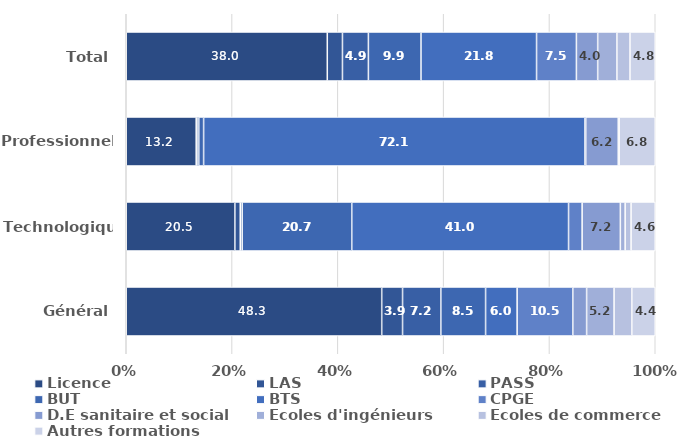
| Category | Licence | LAS | PASS | BUT | BTS | CPGE | D.E sanitaire et social | Ecoles d'ingénieurs | Ecoles de commerce | Autres formations |
|---|---|---|---|---|---|---|---|---|---|---|
| Général | 48.292 | 3.938 | 7.239 | 8.457 | 5.966 | 10.522 | 2.612 | 5.19 | 3.352 | 4.432 |
| Technologique | 20.53 | 1.021 | 0.362 | 20.717 | 40.982 | 2.566 | 7.225 | 0.907 | 1.121 | 4.57 |
| Professionnel | 13.224 | 0.323 | 0.164 | 0.914 | 72.066 | 0.17 | 6.161 | 0.008 | 0.151 | 6.82 |
| Total | 38.004 | 2.866 | 4.904 | 9.943 | 21.845 | 7.534 | 4.019 | 3.633 | 2.474 | 4.777 |